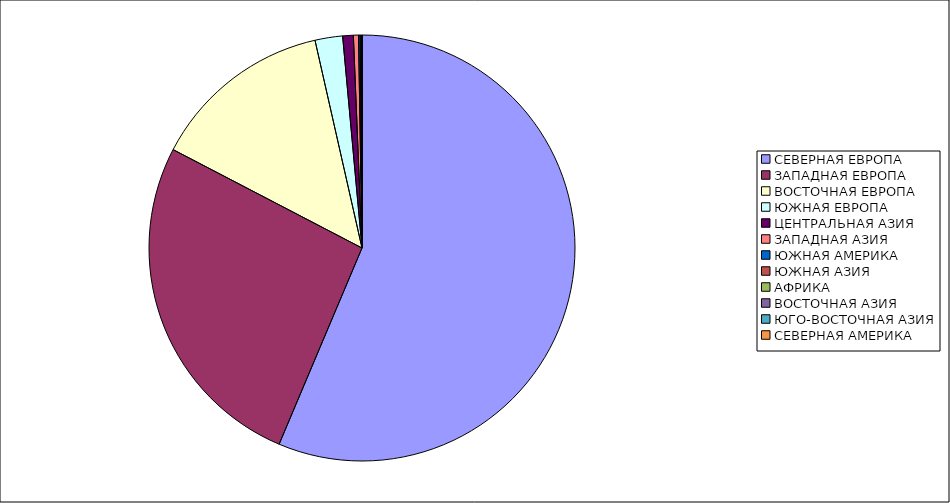
| Category | Оборот |
|---|---|
| СЕВЕРНАЯ ЕВРОПА | 56.361 |
| ЗАПАДНАЯ ЕВРОПА | 26.281 |
| ВОСТОЧНАЯ ЕВРОПА | 13.815 |
| ЮЖНАЯ ЕВРОПА | 2.092 |
| ЦЕНТРАЛЬНАЯ АЗИЯ | 0.805 |
| ЗАПАДНАЯ АЗИЯ | 0.387 |
| ЮЖНАЯ АМЕРИКА | 0.118 |
| ЮЖНАЯ АЗИЯ | 0.077 |
| АФРИКА | 0.035 |
| ВОСТОЧНАЯ АЗИЯ | 0.029 |
| ЮГО-ВОСТОЧНАЯ АЗИЯ | 0.001 |
| СЕВЕРНАЯ АМЕРИКА | 0 |